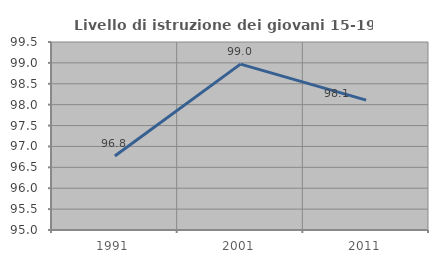
| Category | Livello di istruzione dei giovani 15-19 anni |
|---|---|
| 1991.0 | 96.771 |
| 2001.0 | 98.971 |
| 2011.0 | 98.11 |